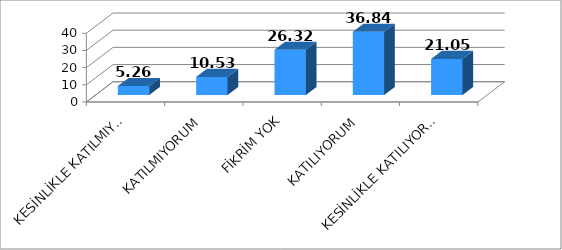
| Category | Series 0 |
|---|---|
| KESİNLİKLE KATILMIYORUM | 5.26 |
| KATILMIYORUM | 10.53 |
| FİKRİM YOK | 26.32 |
| KATILIYORUM | 36.84 |
| KESİNLİKLE KATILIYORUM | 21.05 |